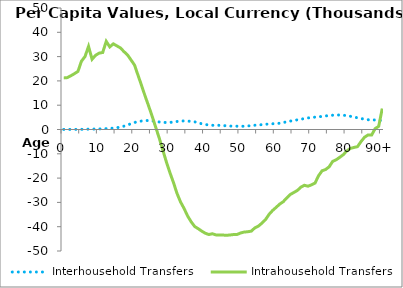
| Category | Interhousehold Transfers | Intrahousehold Transfers |
|---|---|---|
| 0 | 34.912 | 21225.371 |
|  | 38.82 | 21351.569 |
| 2 | 42.728 | 22116.694 |
| 3 | 46.637 | 22956.906 |
| 4 | 50.938 | 23897.914 |
| 5 | 54.497 | 28122.338 |
| 6 | 145.306 | 30013.985 |
| 7 | 152.282 | 34201.294 |
| 8 | 164.805 | 28894.79 |
| 9 | 194.996 | 30548.597 |
| 10 | 241.032 | 31428.666 |
| 11 | 303.556 | 31694.664 |
| 12 | 366.783 | 36274.274 |
| 13 | 455.161 | 33993.395 |
| 14 | 565.211 | 35259.991 |
| 15 | 753.93 | 34422.179 |
| 16 | 975.111 | 33576.809 |
| 17 | 1379.507 | 32061.141 |
| 18 | 1836.082 | 30720.246 |
| 19 | 2390.048 | 28636.13 |
| 20 | 2865.001 | 26509.07 |
| 21 | 3291.774 | 22246.905 |
| 22 | 3484.271 | 18063.777 |
| 23 | 3648.598 | 13700.628 |
| 24 | 3723.138 | 9609.265 |
| 25 | 3585.68 | 5351.352 |
| 26 | 3300.643 | 855.176 |
| 27 | 3101.864 | -3629.269 |
| 28 | 2980.558 | -8534.39 |
| 29 | 2860.362 | -13349.198 |
| 30 | 2893.481 | -17747.22 |
| 31 | 3077.85 | -21825.733 |
| 32 | 3291.088 | -26292.292 |
| 33 | 3427.691 | -29811.869 |
| 34 | 3566.714 | -32501.656 |
| 35 | 3504.013 | -35598.657 |
| 36 | 3292.934 | -37975.36 |
| 37 | 3149.462 | -39921.342 |
| 38 | 2756.356 | -40831.555 |
| 39 | 2359.088 | -41820.131 |
| 40 | 2024.287 | -42691.516 |
| 41 | 1892.49 | -43219.167 |
| 42 | 1734.411 | -42896.098 |
| 43 | 1687.993 | -43372.301 |
| 44 | 1734.052 | -43377.732 |
| 45 | 1654.914 | -43443.262 |
| 46 | 1495.381 | -43524.051 |
| 47 | 1409.063 | -43413.388 |
| 48 | 1437.866 | -43216.908 |
| 49 | 1354.297 | -43188.9 |
| 50 | 1340.671 | -42572.402 |
| 51 | 1329.486 | -42195.986 |
| 52 | 1462.399 | -42079.846 |
| 53 | 1569.565 | -41825.899 |
| 54 | 1751.755 | -40483.84 |
| 55 | 1896.099 | -39751.746 |
| 56 | 1979.043 | -38544.316 |
| 57 | 2191.327 | -37109.372 |
| 58 | 2192.255 | -34953.84 |
| 59 | 2346.516 | -33345.684 |
| 60 | 2509.479 | -32067.805 |
| 61 | 2556.286 | -30731.609 |
| 62 | 2849.423 | -29738.404 |
| 63 | 3175.334 | -28210.745 |
| 64 | 3467.593 | -26760.929 |
| 65 | 3651.716 | -25933.367 |
| 66 | 3987.465 | -25101.228 |
| 67 | 4220.668 | -23738.067 |
| 68 | 4510.013 | -22946.409 |
| 69 | 4754.41 | -23340.12 |
| 70 | 4934.044 | -22781.699 |
| 71 | 5096.4 | -22063.615 |
| 72 | 5268.389 | -19036.834 |
| 73 | 5351.273 | -16984.035 |
| 74 | 5565.759 | -16471.424 |
| 75 | 5788.759 | -15348.777 |
| 76 | 5876.586 | -13120.944 |
| 77 | 5965.393 | -12441.032 |
| 78 | 5958.947 | -11442.828 |
| 79 | 5868.033 | -10347.031 |
| 80 | 5728.645 | -8801.608 |
| 81 | 5428.638 | -7777.17 |
| 82 | 5138.948 | -7388.61 |
| 83 | 4808.005 | -7067.088 |
| 84 | 4495.449 | -4983.763 |
| 85 | 4260.806 | -3174.792 |
| 86 | 4021.137 | -2243.236 |
| 87 | 3891.956 | -2296.33 |
| 88 | 3935.103 | 357.908 |
| 89 | 3814.635 | 1305.568 |
| 90+ | 3606.733 | 8624.512 |